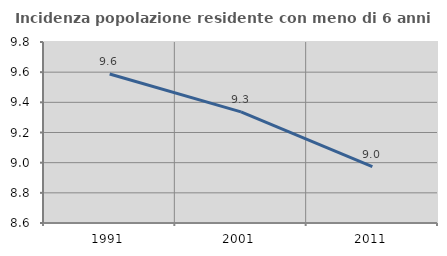
| Category | Incidenza popolazione residente con meno di 6 anni |
|---|---|
| 1991.0 | 9.588 |
| 2001.0 | 9.337 |
| 2011.0 | 8.974 |